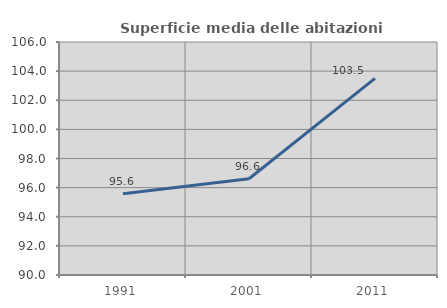
| Category | Superficie media delle abitazioni occupate |
|---|---|
| 1991.0 | 95.573 |
| 2001.0 | 96.611 |
| 2011.0 | 103.504 |